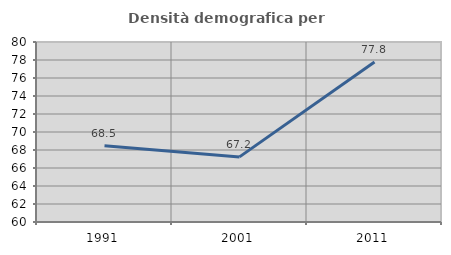
| Category | Densità demografica |
|---|---|
| 1991.0 | 68.461 |
| 2001.0 | 67.234 |
| 2011.0 | 77.786 |